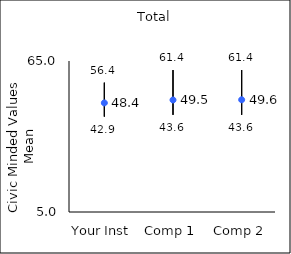
| Category | 25th percentile | 75th percentile | Mean |
|---|---|---|---|
| Your Inst | 42.9 | 56.4 | 48.35 |
| Comp 1 | 43.6 | 61.4 | 49.51 |
| Comp 2 | 43.6 | 61.4 | 49.6 |